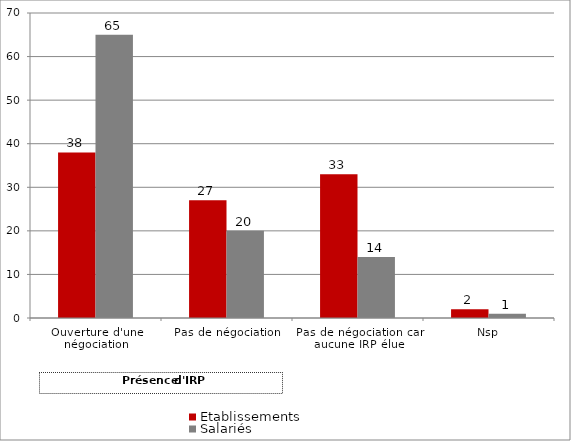
| Category | Etablissements | Salariés |
|---|---|---|
| Ouverture d'une négociation | 38 | 65 |
| Pas de négociation | 27 | 20 |
| Pas de négociation car aucune IRP élue | 33 | 14 |
| Nsp | 2 | 1 |